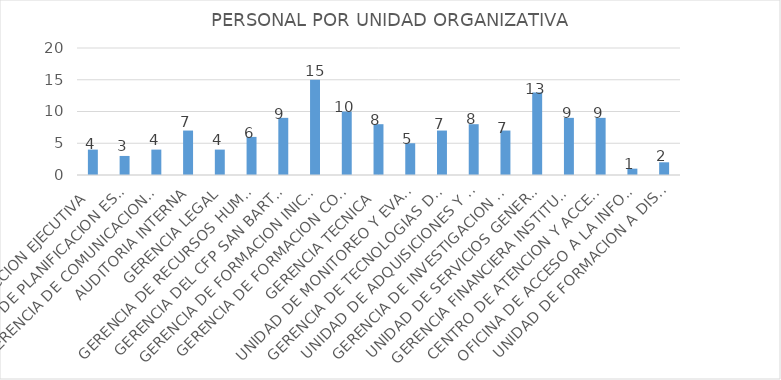
| Category | NUMERO DE PERSONAL |
|---|---|
| DIRECCION EJECUTIVA | 4 |
| UNIDAD DE PLANIFICACION ESTRATEGICA | 3 |
| GERENCIA DE COMUNICACIONES INSTITUCIONAL | 4 |
| AUDITORIA INTERNA | 7 |
| GERENCIA LEGAL | 4 |
| GERENCIA DE RECURSOS HUMANOS | 6 |
| GERENCIA DEL CFP SAN BARTOLO | 9 |
| GERENCIA DE FORMACION INICIAL | 15 |
| GERENCIA DE FORMACION CONTINUA | 10 |
| GERENCIA TECNICA | 8 |
| UNIDAD DE MONITOREO Y EVALUACION DE LA FORMACION PROFESIONAL | 5 |
| GERENCIA DE TECNOLOGIAS DE LA INFORMACION | 7 |
| UNIDAD DE ADQUISICIONES Y CONTRATACIONES INSTITUCIONAL | 8 |
| GERENCIA DE INVESTIGACION Y ESTUDIOS DE LA FORMACION PROFESIONAL | 7 |
| UNIDAD DE SERVICIOS GENERALES | 13 |
| GERENCIA FINANCIERA INSTITUCIONAL | 9 |
| CENTRO DE ATENCION Y ACCESO A LA INFORMACION | 9 |
| OFICINA DE ACCESO A LA INFORMACION PUBLICA | 1 |
| UNIDAD DE FORMACION A DISTANCIA | 2 |